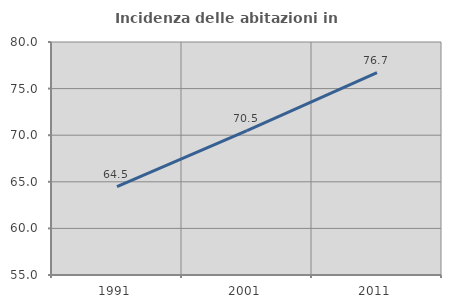
| Category | Incidenza delle abitazioni in proprietà  |
|---|---|
| 1991.0 | 64.485 |
| 2001.0 | 70.501 |
| 2011.0 | 76.702 |